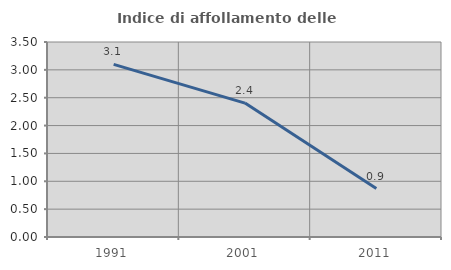
| Category | Indice di affollamento delle abitazioni  |
|---|---|
| 1991.0 | 3.097 |
| 2001.0 | 2.404 |
| 2011.0 | 0.87 |